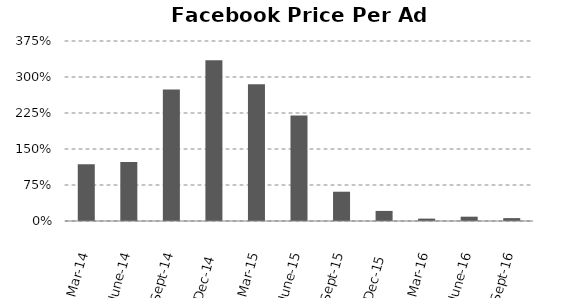
| Category | Growth in price per ad (%, year-over-year) |
|---|---|
| Mar-14 | 1.18 |
| June-14 | 1.23 |
| Sept-14 | 2.74 |
| Dec-14 | 3.35 |
| Mar-15 | 2.85 |
| June-15 | 2.2 |
| Sept-15 | 0.61 |
| Dec-15 | 0.21 |
| Mar-16 | 0.05 |
| June-16 | 0.09 |
| Sept-16 | 0.06 |